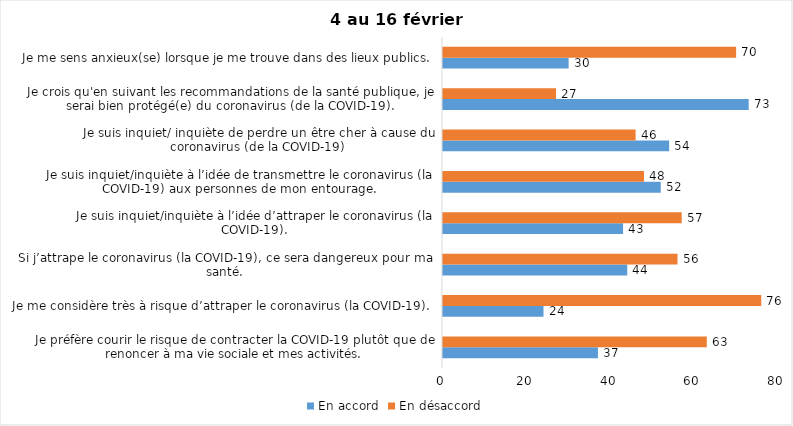
| Category | En accord | En désaccord |
|---|---|---|
| Je préfère courir le risque de contracter la COVID-19 plutôt que de renoncer à ma vie sociale et mes activités. | 37 | 63 |
| Je me considère très à risque d’attraper le coronavirus (la COVID-19). | 24 | 76 |
| Si j’attrape le coronavirus (la COVID-19), ce sera dangereux pour ma santé. | 44 | 56 |
| Je suis inquiet/inquiète à l’idée d’attraper le coronavirus (la COVID-19). | 43 | 57 |
| Je suis inquiet/inquiète à l’idée de transmettre le coronavirus (la COVID-19) aux personnes de mon entourage. | 52 | 48 |
| Je suis inquiet/ inquiète de perdre un être cher à cause du coronavirus (de la COVID-19) | 54 | 46 |
| Je crois qu'en suivant les recommandations de la santé publique, je serai bien protégé(e) du coronavirus (de la COVID-19). | 73 | 27 |
| Je me sens anxieux(se) lorsque je me trouve dans des lieux publics. | 30 | 70 |